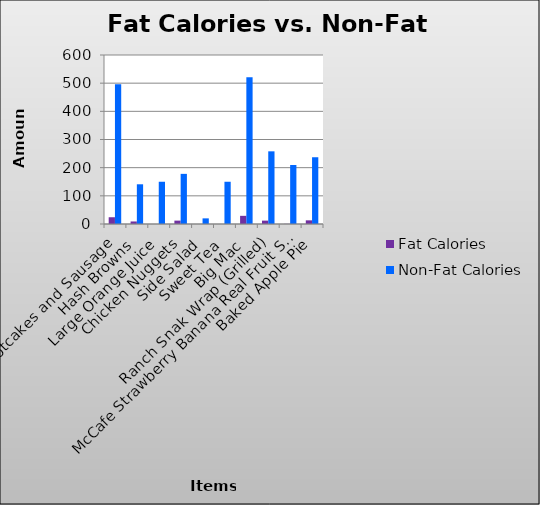
| Category | Fat Calories | Non-Fat Calories |
|---|---|---|
| Hotcakes and Sausage | 24 | 496 |
| Hash Browns | 9 | 141 |
| Large Orange Juice | 0 | 150 |
| Chicken Nuggets | 12 | 178 |
| Side Salad | 0 | 20 |
| Sweet Tea | 0 | 150 |
| Big Mac | 29 | 521 |
| Ranch Snak Wrap (Grilled) | 12 | 258 |
| McCafe Strawberry Banana Real Fruit Smoothie | 0.5 | 209.5 |
| Baked Apple Pie | 13 | 237 |